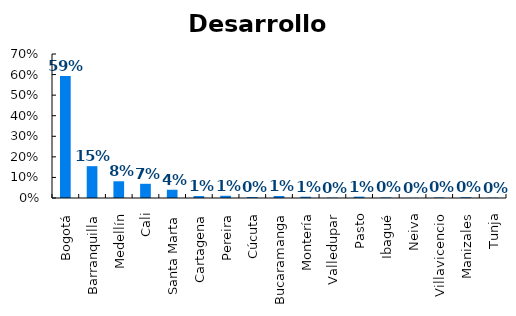
| Category | Desarrollo Urbano |
|---|---|
| Bogotá | 0.594 |
| Barranquilla | 0.155 |
| Medellín | 0.081 |
| Cali | 0.069 |
| Santa Marta | 0.04 |
| Cartagena | 0.009 |
| Pereira | 0.011 |
| Cúcuta | 0.005 |
| Bucaramanga | 0.01 |
| Montería | 0.006 |
| Valledupar | 0.002 |
| Pasto | 0.007 |
| Ibagué | 0.003 |
| Neiva | 0.001 |
| Villavicencio | 0.003 |
| Manizales | 0.004 |
| Tunja | 0.002 |